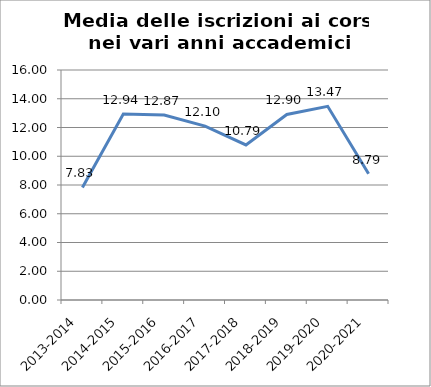
| Category | Media delle iscrizioni ai Corsi |
|---|---|
| 2013-2014 | 7.833 |
| 2014-2015 | 12.935 |
| 2015-2016 | 12.87 |
| 2016-2017 | 12.098 |
| 2017-2018 | 10.787 |
| 2018-2019 | 12.905 |
| 2019-2020 | 13.474 |
| 2020-2021 | 8.787 |